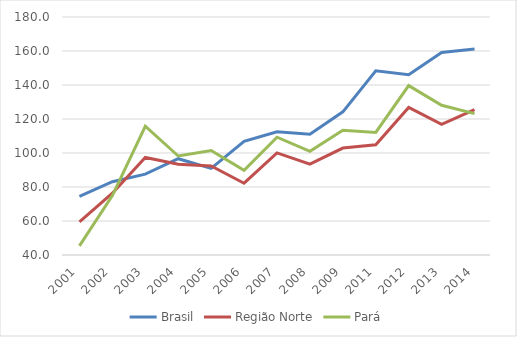
| Category | Brasil | Região Norte | Pará |
|---|---|---|---|
| 2001.0 | 74.53 | 59.521 | 45.333 |
| 2002.0 | 83.092 | 76.341 | 74.933 |
| 2003.0 | 87.545 | 97.373 | 115.741 |
| 2004.0 | 96.651 | 93.349 | 98.238 |
| 2005.0 | 90.93 | 92.425 | 101.44 |
| 2006.0 | 106.812 | 82.229 | 89.807 |
| 2007.0 | 112.466 | 100.028 | 109.309 |
| 2008.0 | 111.013 | 93.466 | 100.98 |
| 2009.0 | 124.225 | 102.915 | 113.366 |
| 2011.0 | 148.383 | 104.804 | 112.113 |
| 2012.0 | 146.057 | 126.788 | 139.632 |
| 2013.0 | 159.169 | 116.842 | 128.053 |
| 2014.0 | 161.157 | 125.537 | 123.173 |